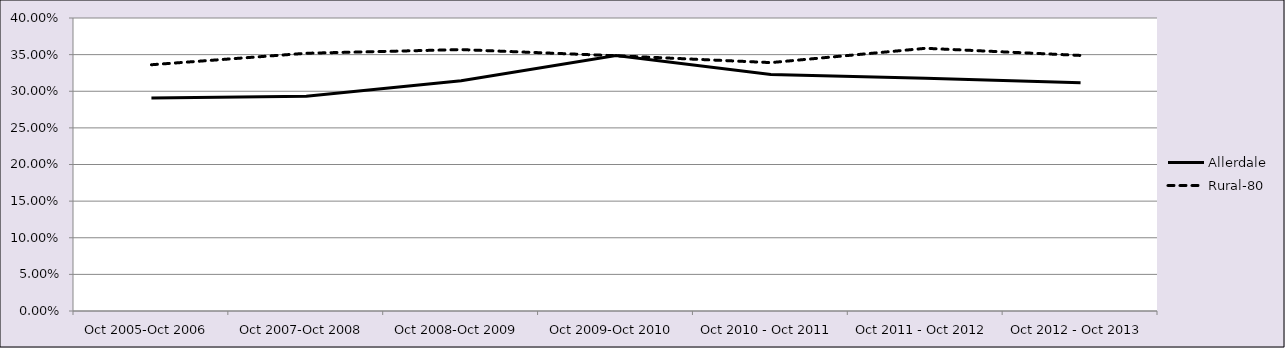
| Category | Allerdale | Rural-80 |
|---|---|---|
| Oct 2005-Oct 2006 | 0.291 | 0.336 |
| Oct 2007-Oct 2008 | 0.293 | 0.352 |
| Oct 2008-Oct 2009 | 0.314 | 0.357 |
| Oct 2009-Oct 2010 | 0.349 | 0.348 |
| Oct 2010 - Oct 2011 | 0.323 | 0.339 |
| Oct 2011 - Oct 2012 | 0.318 | 0.359 |
| Oct 2012 - Oct 2013 | 0.312 | 0.349 |